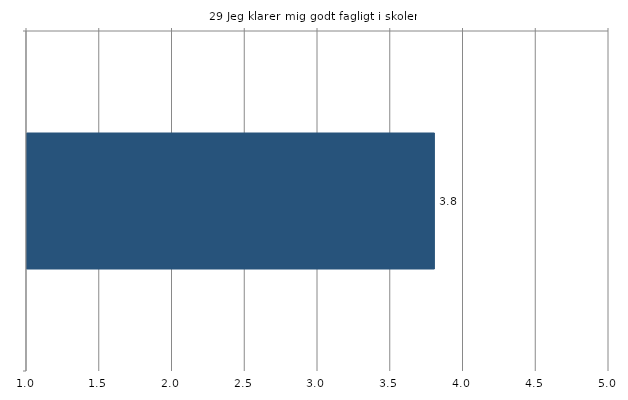
| Category | Gns. |
|---|---|
|   | 3.8 |